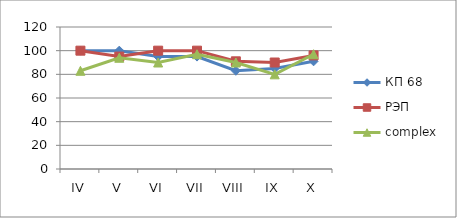
| Category | КП 68 | РЭП  | complex |
|---|---|---|---|
| IV | 100 | 100 | 83 |
| V | 100 | 95 | 94 |
| VI | 95 | 100 | 90 |
| VII | 95 | 100 | 97 |
| VIII | 83 | 91 | 90 |
| IX | 85 | 90 | 80 |
| X | 91 | 96 | 97 |